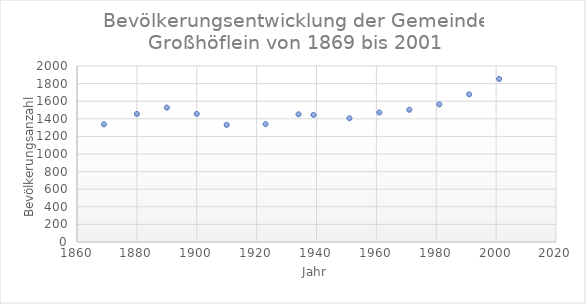
| Category | Series 0 |
|---|---|
| 1869.0 | 1338 |
| 1880.0 | 1455 |
| 1890.0 | 1527 |
| 1900.0 | 1456 |
| 1910.0 | 1331 |
| 1923.0 | 1339 |
| 1934.0 | 1451 |
| 1939.0 | 1445 |
| 1951.0 | 1406 |
| 1961.0 | 1472 |
| 1971.0 | 1503 |
| 1981.0 | 1564 |
| 1991.0 | 1678 |
| 2001.0 | 1853 |